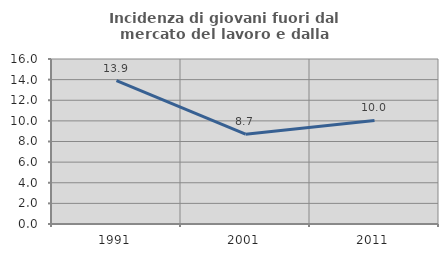
| Category | Incidenza di giovani fuori dal mercato del lavoro e dalla formazione  |
|---|---|
| 1991.0 | 13.907 |
| 2001.0 | 8.706 |
| 2011.0 | 10.037 |